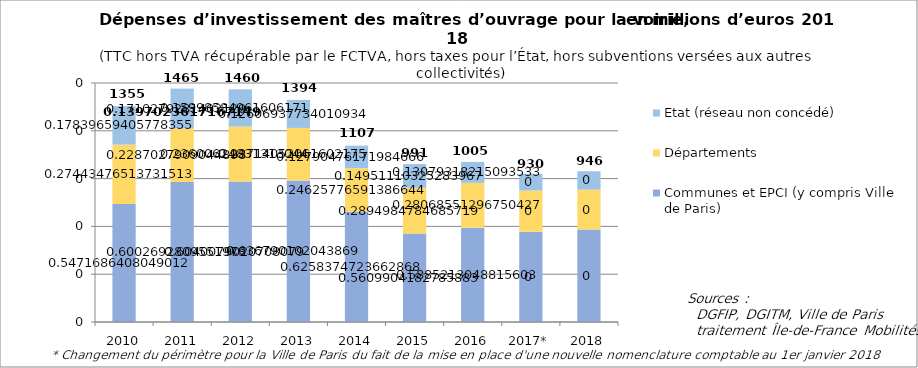
| Category | Communes et EPCI (y compris Ville de Paris) | Départements | Etat (réseau non concédé) |
|---|---|---|---|
| 2010 | 741272997.539 | 371788632.994 | 241681573.406 |
| 2011 | 879351137.458 | 335033068.828 | 250543560.896 |
| 2012 | 882030219.449 | 344638939.784 | 233626668.727 |
| 2013 | 887512452.874 | 330509479.422 | 175706472.127 |
| 2014 | 692640499.151 | 272543766.447 | 141557547.947 |
| 2015 | 555949381.128 | 286897056.88 | 148167602.542 |
| 2016 | 591317073.699 | 282018908.714 | 131414514.798 |
| 2017* | 566489725.636 | 258454519.636 | 104737529.448 |
| 2018 | 580553242.37 | 250019791.691 | 115666666.667 |